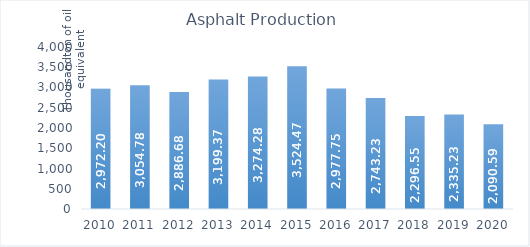
| Category | Asphalt Production* |
|---|---|
| 2010.0 | 2972.2 |
| 2011.0 | 3054.78 |
| 2012.0 | 2886.68 |
| 2013.0 | 3199.37 |
| 2014.0 | 3274.28 |
| 2015.0 | 3524.47 |
| 2016.0 | 2977.75 |
| 2017.0 | 2743.23 |
| 2018.0 | 2296.55 |
| 2019.0 | 2335.23 |
| 2020.0 | 2090.59 |